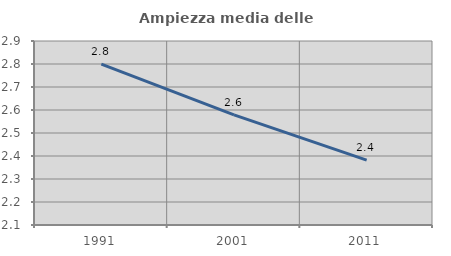
| Category | Ampiezza media delle famiglie |
|---|---|
| 1991.0 | 2.8 |
| 2001.0 | 2.579 |
| 2011.0 | 2.382 |